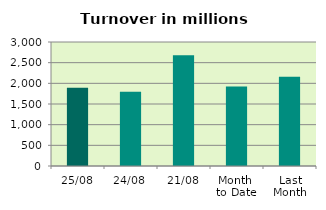
| Category | Series 0 |
|---|---|
| 25/08 | 1892.02 |
| 24/08 | 1796.285 |
| 21/08 | 2682.098 |
| Month 
to Date | 1920.57 |
| Last
Month | 2162.227 |